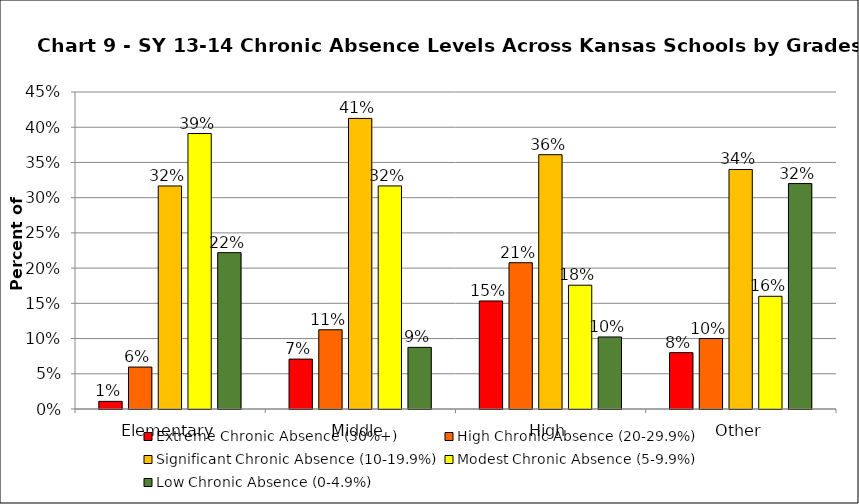
| Category | Extreme Chronic Absence (30%+) | High Chronic Absence (20-29.9%) | Significant Chronic Absence (10-19.9%) | Modest Chronic Absence (5-9.9%) | Low Chronic Absence (0-4.9%) |
|---|---|---|---|---|---|
| 0 | 0.011 | 0.06 | 0.317 | 0.391 | 0.222 |
| 1 | 0.071 | 0.112 | 0.412 | 0.317 | 0.088 |
| 2 | 0.153 | 0.208 | 0.361 | 0.176 | 0.102 |
| 3 | 0.08 | 0.1 | 0.34 | 0.16 | 0.32 |